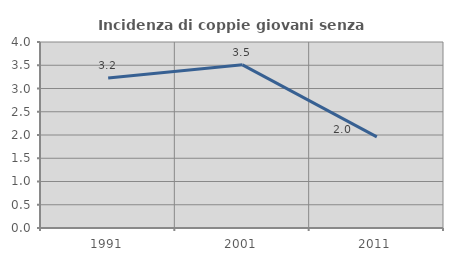
| Category | Incidenza di coppie giovani senza figli |
|---|---|
| 1991.0 | 3.226 |
| 2001.0 | 3.509 |
| 2011.0 | 1.961 |